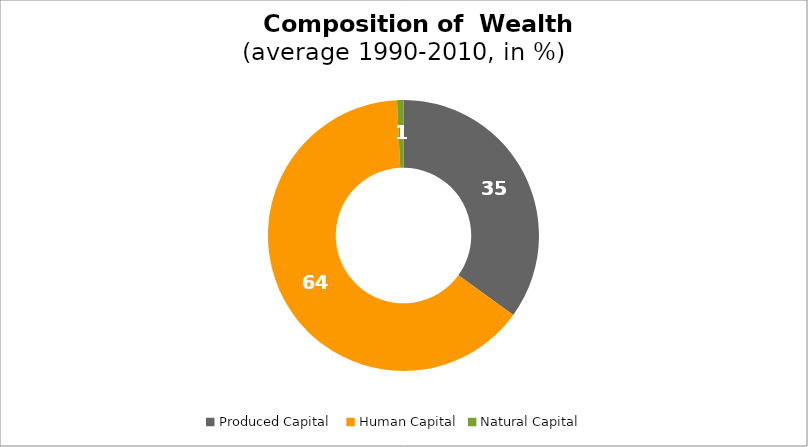
| Category | Series 0 |
|---|---|
| Produced Capital  | 34.966 |
| Human Capital | 64.264 |
| Natural Capital | 0.77 |